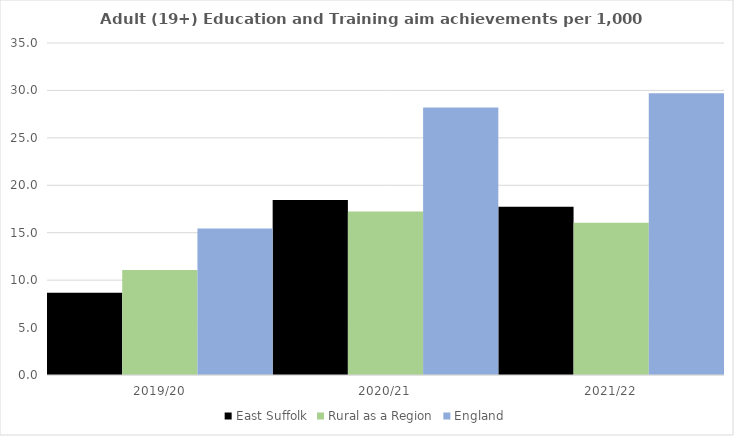
| Category | East Suffolk | Rural as a Region | England |
|---|---|---|---|
| 2019/20 | 8.662 | 11.081 | 15.446 |
| 2020/21 | 18.436 | 17.224 | 28.211 |
| 2021/22 | 17.738 | 16.063 | 29.711 |